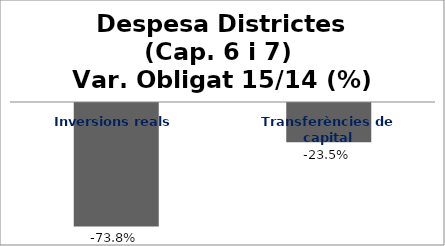
| Category | Series 0 |
|---|---|
| Inversions reals | -0.738 |
| Transferències de capital | -0.235 |